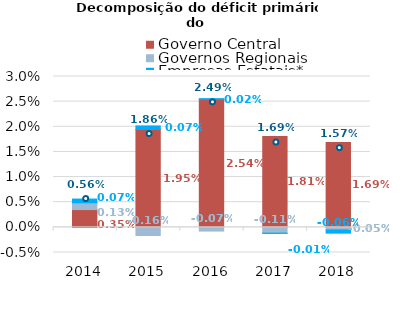
| Category | Governo Central | Governos Regionais | Empresas Estatais* |
|---|---|---|---|
| 2014.0 | 0.004 | 0.001 | 0.001 |
| 2015.0 | 0.019 | -0.002 | 0.001 |
| 2016.0 | 0.025 | -0.001 | 0 |
| 2017.0 | 0.018 | -0.001 | 0 |
| 2018.0 | 0.017 | -0.001 | -0.001 |